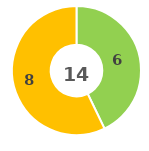
| Category | Series 0 |
|---|---|
| 0 | 0 |
| 1 | 6 |
| 2 | 8 |
| 3 | 0 |
| 4 | 0 |